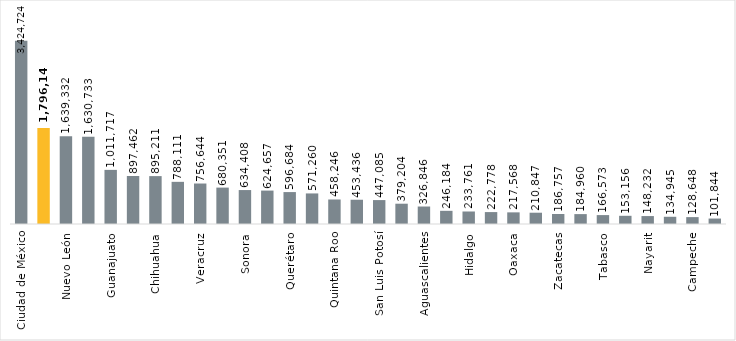
| Category | Series 0 |
|---|---|
| Ciudad de México | 3424724 |
| Jalisco | 1796144 |
| Nuevo León | 1639332 |
| Estado de México | 1630733 |
| Guanajuato | 1011717 |
| Baja California | 897462 |
| Chihuahua | 895211 |
| Coahuila | 788111 |
| Veracruz | 756644 |
| Tamaulipas | 680351 |
| Sonora | 634408 |
| Puebla | 624657 |
| Querétaro | 596684 |
| Sinaloa | 571260 |
| Quintana Roo | 458246 |
| Michoacán | 453436 |
| San Luis Potosí | 447085 |
| Yucatán | 379204 |
| Aguascalientes | 326846 |
| Durango | 246184 |
| Hidalgo | 233761 |
| Chiapas | 222778 |
| Oaxaca | 217568 |
| Morelos | 210847 |
| Zacatecas | 186757 |
| Baja California Sur | 184960 |
| Tabasco | 166573 |
| Guerrero | 153156 |
| Nayarit | 148232 |
| Colima | 134945 |
| Campeche | 128648 |
| Tlaxcala | 101844 |